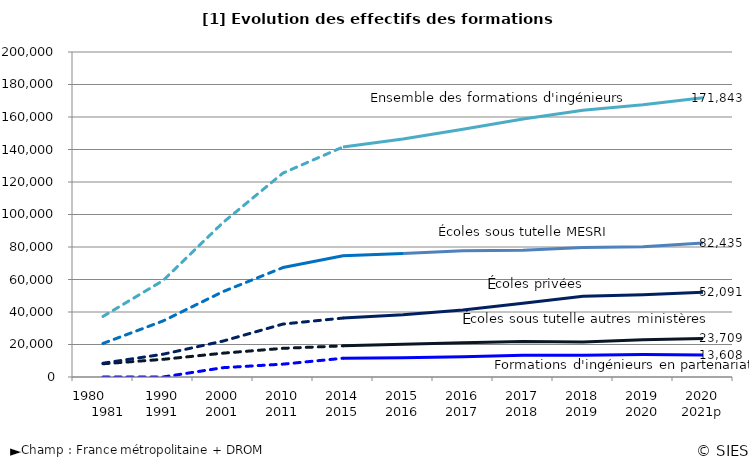
| Category | Écoles sous tutelle du MESRI | Écoles sous tutelle d'un autre ministère ou d'une collectivité locale | Écoles privées | Formations d’ingénieurs en partenariat (FIP) | Ensemble des formations d'ingénieurs |
|---|---|---|---|---|---|
| 1980          1981 | 20650 | 8127 | 8490 | 0 | 37267 |
| 1990
1991 | 34475 | 10865 | 14002 | 0 | 59342 |
| 2000
2001 | 52537 | 14670 | 22106 | 5741 | 95054 |
| 2010
2011 | 67353 | 17643 | 32586 | 7919 | 125501 |
| 2014
2015 | 74566 | 19165 | 36272 | 11543 | 141546 |
| 2015
2016 | 75975 | 20211 | 38337 | 11909 | 146432 |
| 2016
2017 | 77700 | 21022 | 41275 | 12508 | 152505 |
| 2017
2018 | 77977 | 21894 | 45451 | 13452 | 158774 |
| 2018
2019 | 79764 | 21474 | 49618 | 13321 | 164177 |
| 2019
2020 | 80230 | 22913 | 50615 | 13789 | 167547 |
| 2020
2021p | 82435 | 23709 | 52091 | 13608 | 171843 |